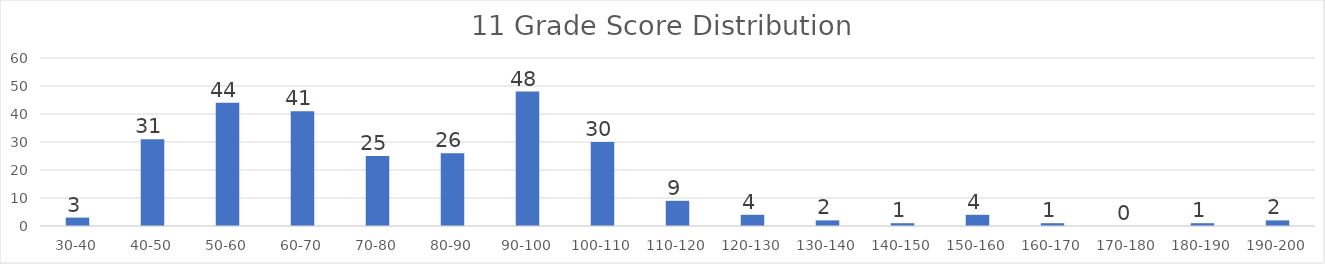
| Category | Series 0 |
|---|---|
| 30-40 | 3 |
| 40-50 | 31 |
| 50-60 | 44 |
| 60-70 | 41 |
| 70-80 | 25 |
| 80-90 | 26 |
| 90-100 | 48 |
| 100-110 | 30 |
| 110-120 | 9 |
| 120-130 | 4 |
| 130-140 | 2 |
| 140-150 | 1 |
| 150-160 | 4 |
| 160-170 | 1 |
| 170-180 | 0 |
| 180-190 | 1 |
| 190-200 | 2 |